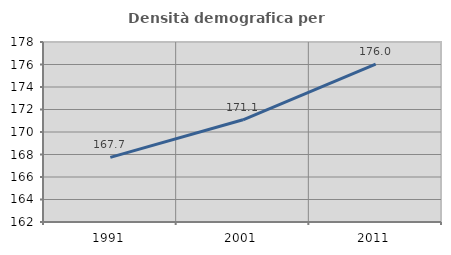
| Category | Densità demografica |
|---|---|
| 1991.0 | 167.748 |
| 2001.0 | 171.086 |
| 2011.0 | 176.031 |